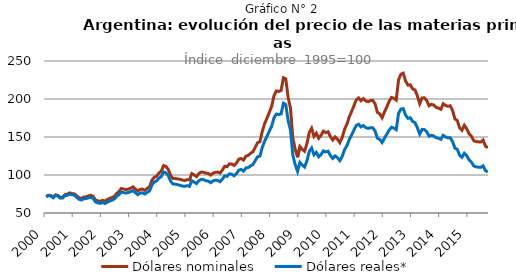
| Category | Dólares nominales | Dólares reales* |
|---|---|---|
| 2000.0 | 71.674 | 71.459 |
| nan | 73.429 | 72.918 |
| nan | 72.97 | 72.105 |
| nan | 70.937 | 70.027 |
| nan | 73.906 | 73.03 |
| nan | 73.173 | 72.306 |
| nan | 70.533 | 69.559 |
| nan | 70.793 | 69.678 |
| nan | 74.26 | 72.876 |
| nan | 74.872 | 73.26 |
| nan | 76.447 | 74.801 |
| nan | 75.571 | 74.162 |
| 2001.0 | 75.093 | 73.477 |
| nan | 72.633 | 70.723 |
| nan | 70.243 | 68.065 |
| nan | 69.256 | 67.108 |
| nan | 70.978 | 68.844 |
| nan | 71.286 | 68.942 |
| nan | 72.573 | 70.119 |
| nan | 73.338 | 70.653 |
| nan | 71.903 | 69.204 |
| nan | 67.13 | 64.424 |
| nan | 66.006 | 63.284 |
| nan | 65.347 | 62.773 |
| 2002.0 | 66.61 | 63.864 |
| nan | 65.444 | 62.447 |
| nan | 67.581 | 64.24 |
| nan | 69.267 | 65.78 |
| nan | 70.284 | 66.746 |
| nan | 71.774 | 68.291 |
| nan | 75.713 | 71.903 |
| nan | 78.185 | 74.039 |
| nan | 82.274 | 77.691 |
| nan | 81.553 | 76.864 |
| nan | 80.79 | 76.217 |
| nan | 81.498 | 77.031 |
| 2003.0 | 82.655 | 77.976 |
| nan | 84.437 | 79.508 |
| nan | 81.567 | 76.588 |
| nan | 78.943 | 74.125 |
| nan | 81.142 | 76.19 |
| nan | 81.469 | 76.569 |
| nan | 79.818 | 74.947 |
| nan | 82.393 | 77.22 |
| nan | 84.472 | 79.094 |
| nan | 93.123 | 86.95 |
| nan | 96.998 | 90.737 |
| nan | 98.272 | 92.188 |
| 2004.0 | 102.596 | 95.884 |
| nan | 105.198 | 97.859 |
| nan | 112.45 | 104.024 |
| nan | 111.232 | 102.707 |
| nan | 107.186 | 98.972 |
| nan | 99.153 | 91.638 |
| nan | 95.32 | 88.015 |
| nan | 95.374 | 87.983 |
| nan | 94.869 | 87.196 |
| nan | 94.342 | 86.394 |
| nan | 93.374 | 85.507 |
| nan | 92.71 | 85.055 |
| 2005.0 | 93.977 | 85.981 |
| nan | 93.494 | 85.149 |
| nan | 101.837 | 92.411 |
| nan | 100.065 | 90.639 |
| nan | 97.83 | 88.694 |
| nan | 102.006 | 92.564 |
| nan | 103.874 | 94.26 |
| nan | 103.654 | 93.889 |
| nan | 102.357 | 92.463 |
| nan | 102.046 | 91.85 |
| nan | 99.842 | 89.866 |
| nan | 102.34 | 92.198 |
| 2006.0 | 103.523 | 93.096 |
| nan | 103.876 | 92.913 |
| nan | 102.444 | 91.142 |
| nan | 106.577 | 94.567 |
| nan | 111.485 | 98.922 |
| nan | 110.923 | 98.249 |
| nan | 114.649 | 101.459 |
| nan | 114.45 | 101.015 |
| nan | 112.463 | 99 |
| nan | 115.728 | 101.694 |
| nan | 120.915 | 106.439 |
| nan | 121.682 | 107.303 |
| 2007.0 | 119.56 | 105.103 |
| nan | 124.796 | 109.206 |
| nan | 125.888 | 109.828 |
| nan | 128.51 | 111.913 |
| nan | 130.509 | 113.708 |
| nan | 136.464 | 118.886 |
| nan | 142.475 | 124.013 |
| nan | 143.81 | 124.876 |
| nan | 157.598 | 136.488 |
| nan | 167.495 | 144.625 |
| nan | 174.726 | 150.883 |
| nan | 182.453 | 157.794 |
| 2008.0 | 190.52 | 164.23 |
| nan | 204.582 | 175.719 |
| nan | 210.613 | 180.135 |
| nan | 209.95 | 179.397 |
| nan | 211.249 | 180.412 |
| nan | 227.945 | 194.422 |
| nan | 226.507 | 192.719 |
| nan | 201.928 | 171.378 |
| nan | 187.798 | 159.066 |
| nan | 148.884 | 125.955 |
| nan | 134.224 | 113.763 |
| nan | 123.301 | 104.827 |
| 2009.0 | 137.475 | 116.55 |
| nan | 133.869 | 113.115 |
| nan | 131.246 | 110.47 |
| nan | 141.417 | 118.798 |
| nan | 156.006 | 131.072 |
| nan | 161.482 | 135.568 |
| nan | 150.816 | 126.556 |
| nan | 154.941 | 129.766 |
| nan | 148.349 | 123.941 |
| nan | 152.138 | 126.824 |
| nan | 157.722 | 131.789 |
| nan | 155.756 | 130.393 |
| 2010.0 | 156.957 | 131.369 |
| nan | 150.295 | 125.554 |
| nan | 146.018 | 121.775 |
| nan | 150.109 | 125.137 |
| nan | 147.154 | 122.684 |
| nan | 142.572 | 118.861 |
| nan | 149.138 | 124.326 |
| nan | 160.075 | 133.22 |
| nan | 166.724 | 138.558 |
| nan | 176.303 | 146.398 |
| nan | 183.511 | 152.508 |
| nan | 191.117 | 159.038 |
| 2011.0 | 198.888 | 165.18 |
| nan | 201.449 | 166.786 |
| nan | 197.724 | 163.269 |
| nan | 200.547 | 165.096 |
| nan | 197.474 | 162.359 |
| nan | 196.42 | 161.304 |
| nan | 197.862 | 162.277 |
| nan | 198.241 | 162.061 |
| nan | 193.794 | 158.017 |
| nan | 182.509 | 148.52 |
| nan | 180.347 | 146.745 |
| nan | 175.311 | 142.749 |
| 2012.0 | 182.817 | 148.501 |
| nan | 189.599 | 153.65 |
| nan | 197.002 | 159.069 |
| nan | 202.066 | 162.774 |
| nan | 200.995 | 161.716 |
| nan | 198.584 | 159.62 |
| nan | 225.269 | 181.027 |
| nan | 232.615 | 186.69 |
| nan | 234.037 | 187.366 |
| nan | 223.532 | 178.682 |
| nan | 218.27 | 174.601 |
| nan | 218.681 | 175.252 |
| 2013.0 | 213.268 | 170.524 |
| nan | 211.924 | 168.852 |
| nan | 204.141 | 162.185 |
| nan | 193.906 | 153.948 |
| nan | 201.426 | 159.819 |
| nan | 201.549 | 159.81 |
| nan | 197.805 | 156.791 |
| nan | 191.083 | 151.14 |
| nan | 192.924 | 152.265 |
| nan | 192.043 | 151.399 |
| nan | 189.004 | 148.937 |
| nan | 188.085 | 148.465 |
| 2014.0 | 186.417 | 146.901 |
| nan | 193.781 | 152.211 |
| nan | 191.621 | 150.061 |
| nan | 190.441 | 148.802 |
| nan | 191.143 | 149.059 |
| nan | 184.663 | 143.956 |
| nan | 173.687 | 135.388 |
| nan | 171.708 | 133.842 |
| nan | 161.926 | 125.981 |
| nan | 158.866 | 123.321 |
| nan | 165.495 | 128.582 |
| nan | 161.051 | 125.404 |
| 2015.0 | 154.287 | 119.917 |
| nan | 151.063 | 117.004 |
| nan | 145.179 | 111.987 |
| nan | 143.919 | 110.679 |
| nan | 143.621 | 110.321 |
| nan | 143.416 | 110.076 |
| nan | 146.039 | 112.079 |
| nan | 137.876 | 105.732 |
| nan | 135.914 | 103.929 |